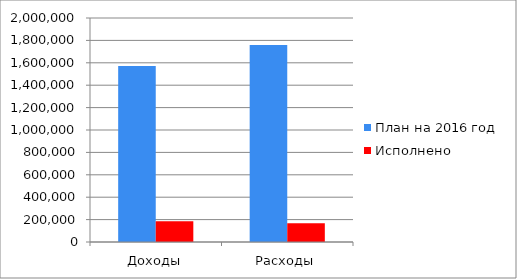
| Category | План на 2016 год | Исполнено  |
|---|---|---|
| Доходы | 1571381 | 185116 |
| Расходы | 1758637 | 167340 |